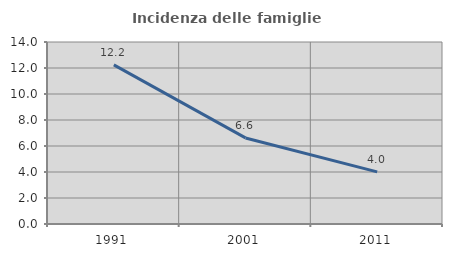
| Category | Incidenza delle famiglie numerose |
|---|---|
| 1991.0 | 12.241 |
| 2001.0 | 6.621 |
| 2011.0 | 4.012 |